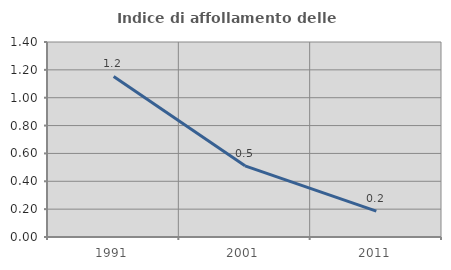
| Category | Indice di affollamento delle abitazioni  |
|---|---|
| 1991.0 | 1.153 |
| 2001.0 | 0.511 |
| 2011.0 | 0.186 |